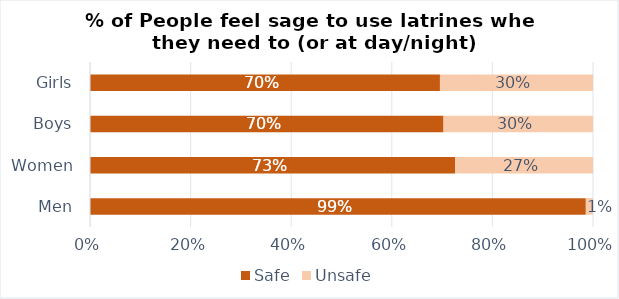
| Category | Safe | Unsafe |
|---|---|---|
| Men | 0.986 | 0.014 |
| Women | 0.726 | 0.274 |
| Boys | 0.703 | 0.297 |
| Girls | 0.696 | 0.304 |